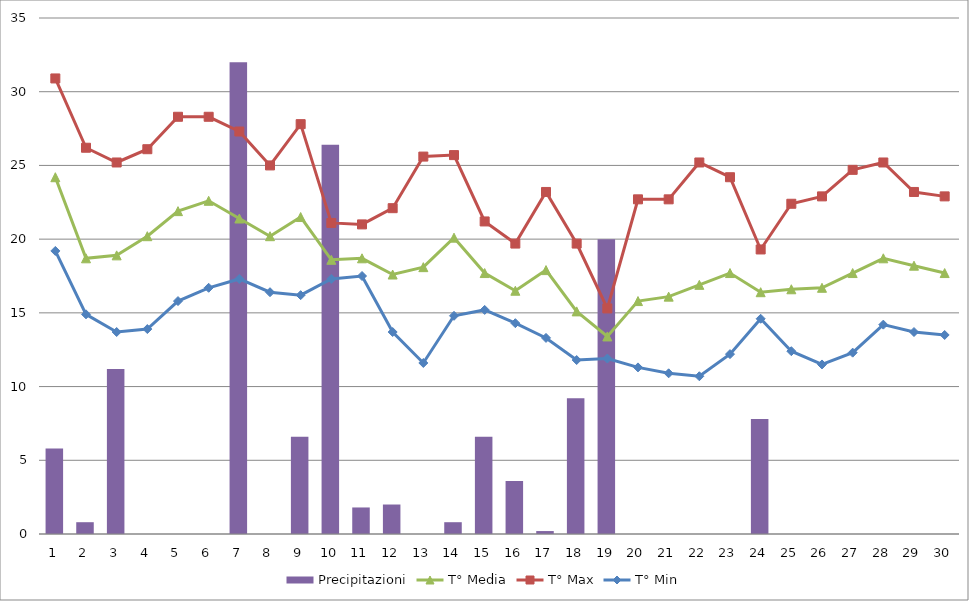
| Category | Precipitazioni |
|---|---|
| 0 | 5.8 |
| 1 | 0.8 |
| 2 | 11.2 |
| 3 | 0 |
| 4 | 0 |
| 5 | 0 |
| 6 | 32 |
| 7 | 0 |
| 8 | 6.6 |
| 9 | 26.4 |
| 10 | 1.8 |
| 11 | 2 |
| 12 | 0 |
| 13 | 0.8 |
| 14 | 6.6 |
| 15 | 3.6 |
| 16 | 0.2 |
| 17 | 9.2 |
| 18 | 20 |
| 19 | 0 |
| 20 | 0 |
| 21 | 0 |
| 22 | 0 |
| 23 | 7.8 |
| 24 | 0 |
| 25 | 0 |
| 26 | 0 |
| 27 | 0 |
| 28 | 0 |
| 29 | 0 |